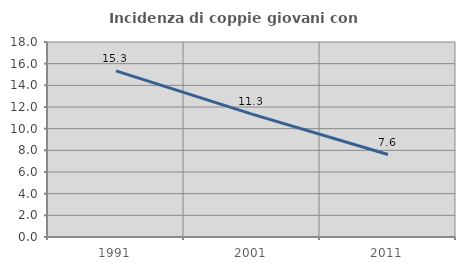
| Category | Incidenza di coppie giovani con figli |
|---|---|
| 1991.0 | 15.34 |
| 2001.0 | 11.346 |
| 2011.0 | 7.615 |